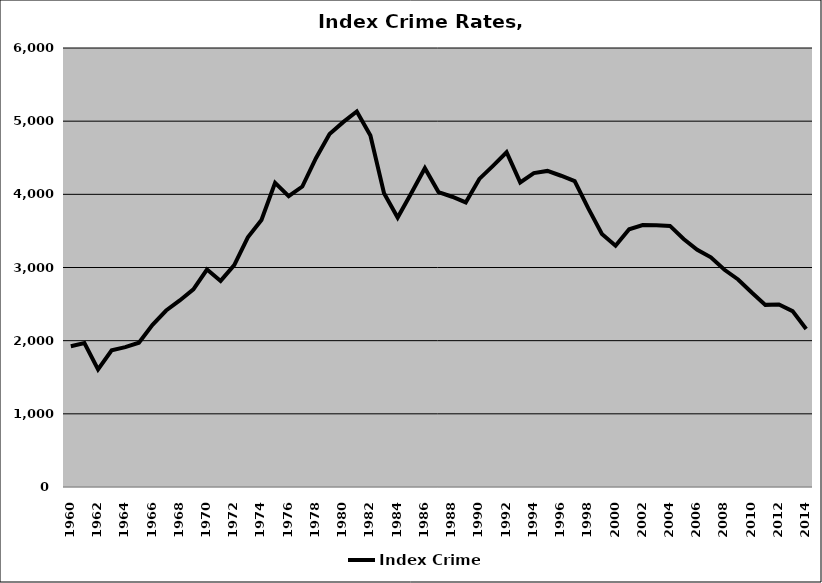
| Category | Index Crime |
|---|---|
| 1960.0 | 1924.161 |
| 1961.0 | 1966.272 |
| 1962.0 | 1607.397 |
| 1963.0 | 1867.656 |
| 1964.0 | 1911.662 |
| 1965.0 | 1972.647 |
| 1966.0 | 2215.502 |
| 1967.0 | 2412.063 |
| 1968.0 | 2549.841 |
| 1969.0 | 2701.562 |
| 1970.0 | 2972.179 |
| 1971.0 | 2816.471 |
| 1972.0 | 3032.174 |
| 1973.0 | 3413.031 |
| 1974.0 | 3650.418 |
| 1975.0 | 4155.882 |
| 1976.0 | 3975.128 |
| 1977.0 | 4106.65 |
| 1978.0 | 4494.575 |
| 1979.0 | 4824 |
| 1980.0 | 4986.417 |
| 1981.0 | 5131.911 |
| 1982.0 | 4803.984 |
| 1983.0 | 4013.813 |
| 1984.0 | 3682.779 |
| 1985.0 | 4015.128 |
| 1986.0 | 4357.199 |
| 1987.0 | 4031.224 |
| 1988.0 | 3967.091 |
| 1989.0 | 3889.053 |
| 1990.0 | 4210.649 |
| 1991.0 | 4388.913 |
| 1992.0 | 4575.107 |
| 1993.0 | 4162.979 |
| 1994.0 | 4289.706 |
| 1995.0 | 4320.208 |
| 1996.0 | 4254.054 |
| 1997.0 | 4180.833 |
| 1998.0 | 3807.692 |
| 1999.0 | 3457.659 |
| 2000.0 | 3298.014 |
| 2001.0 | 3522.402 |
| 2002.0 | 3579.977 |
| 2003.0 | 3577.297 |
| 2004.0 | 3568.386 |
| 2005.0 | 3388.771 |
| 2006.0 | 3242.305 |
| 2007.0 | 3139.453 |
| 2008.0 | 2968.774 |
| 2009.0 | 2836.644 |
| 2010.0 | 2657.436 |
| 2011.0 | 2489.266 |
| 2012.0 | 2494.338 |
| 2013.0 | 2404.055 |
| 2014.0 | 2160.222 |